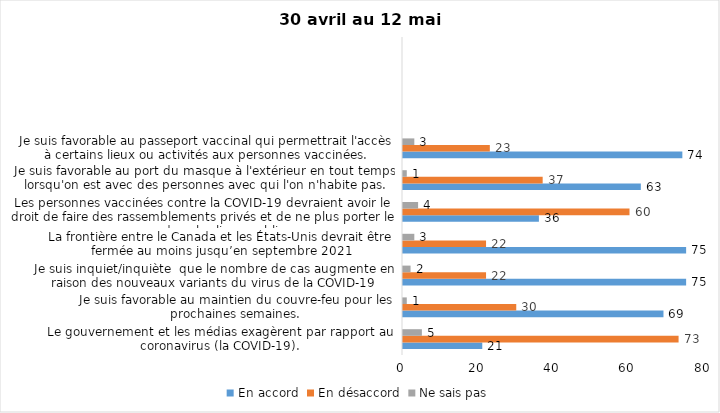
| Category | En accord | En désaccord | Ne sais pas |
|---|---|---|---|
| Le gouvernement et les médias exagèrent par rapport au coronavirus (la COVID-19). | 21 | 73 | 5 |
| Je suis favorable au maintien du couvre-feu pour les prochaines semaines. | 69 | 30 | 1 |
| Je suis inquiet/inquiète  que le nombre de cas augmente en raison des nouveaux variants du virus de la COVID-19 | 75 | 22 | 2 |
| La frontière entre le Canada et les États-Unis devrait être fermée au moins jusqu’en septembre 2021 | 75 | 22 | 3 |
| Les personnes vaccinées contre la COVID-19 devraient avoir le droit de faire des rassemblements privés et de ne plus porter le masque dans les lieux publics. | 36 | 60 | 4 |
| Je suis favorable au port du masque à l'extérieur en tout temps lorsqu'on est avec des personnes avec qui l'on n'habite pas. | 63 | 37 | 1 |
| Je suis favorable au passeport vaccinal qui permettrait l'accès à certains lieux ou activités aux personnes vaccinées. | 74 | 23 | 3 |